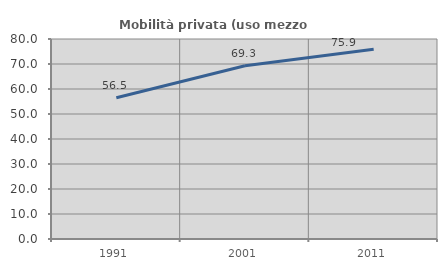
| Category | Mobilità privata (uso mezzo privato) |
|---|---|
| 1991.0 | 56.522 |
| 2001.0 | 69.309 |
| 2011.0 | 75.924 |